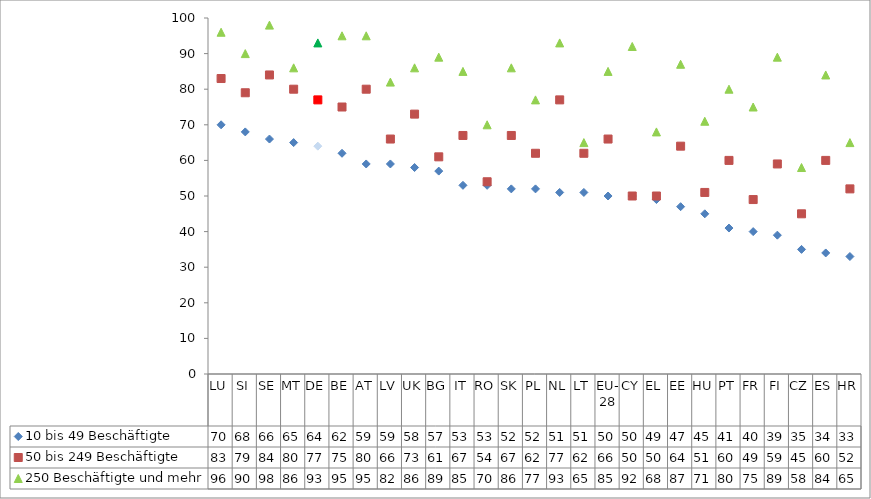
| Category | 10 bis 49 Beschäftigte | 50 bis 249 Beschäftigte | 250 Beschäftigte und mehr |
|---|---|---|---|
| LU | 70 | 83 | 96 |
| SI | 68 | 79 | 90 |
| SE | 66 | 84 | 98 |
| MT | 65 | 80 | 86 |
| DE | 64 | 77 | 93 |
| BE | 62 | 75 | 95 |
| AT | 59 | 80 | 95 |
| LV | 59 | 66 | 82 |
| UK | 58 | 73 | 86 |
| BG | 57 | 61 | 89 |
| IT | 53 | 67 | 85 |
| RO | 53 | 54 | 70 |
| SK | 52 | 67 | 86 |
| PL | 52 | 62 | 77 |
| NL | 51 | 77 | 93 |
| LT | 51 | 62 | 65 |
| EU-28 | 50 | 66 | 85 |
| CY | 50 | 50 | 92 |
| EL | 49 | 50 | 68 |
| EE | 47 | 64 | 87 |
| HU | 45 | 51 | 71 |
| PT | 41 | 60 | 80 |
| FR | 40 | 49 | 75 |
| FI | 39 | 59 | 89 |
| CZ | 35 | 45 | 58 |
| ES | 34 | 60 | 84 |
| HR | 33 | 52 | 65 |